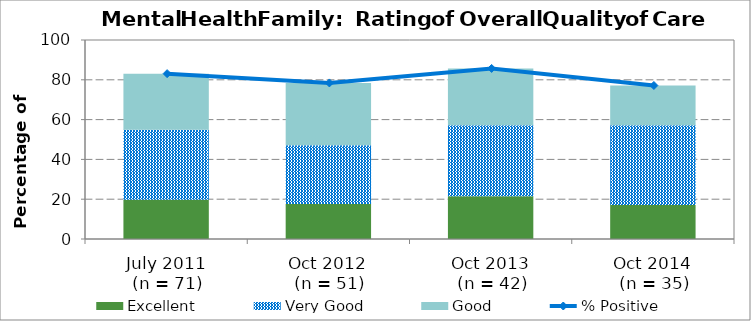
| Category | Excellent | Very Good | Good |
|---|---|---|---|
| July 2011
 (n = 71) | 19.72 | 35.21 | 28.17 |
| Oct 2012
 (n = 51) | 17.65 | 29.41 | 31.37 |
| Oct 2013
 (n = 42) | 21.43 | 35.71 | 28.57 |
| Oct 2014
 (n = 35) | 17.14 | 40 | 20 |